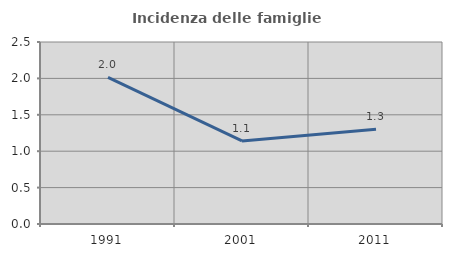
| Category | Incidenza delle famiglie numerose |
|---|---|
| 1991.0 | 2.014 |
| 2001.0 | 1.141 |
| 2011.0 | 1.302 |